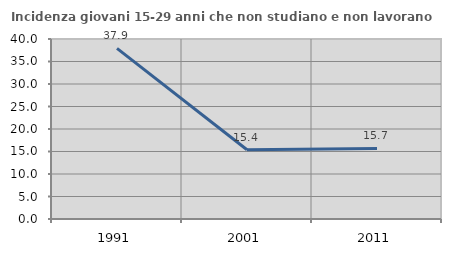
| Category | Incidenza giovani 15-29 anni che non studiano e non lavorano  |
|---|---|
| 1991.0 | 37.917 |
| 2001.0 | 15.385 |
| 2011.0 | 15.686 |